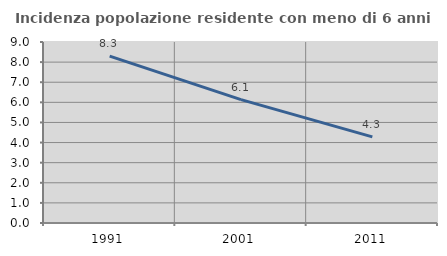
| Category | Incidenza popolazione residente con meno di 6 anni |
|---|---|
| 1991.0 | 8.295 |
| 2001.0 | 6.137 |
| 2011.0 | 4.285 |